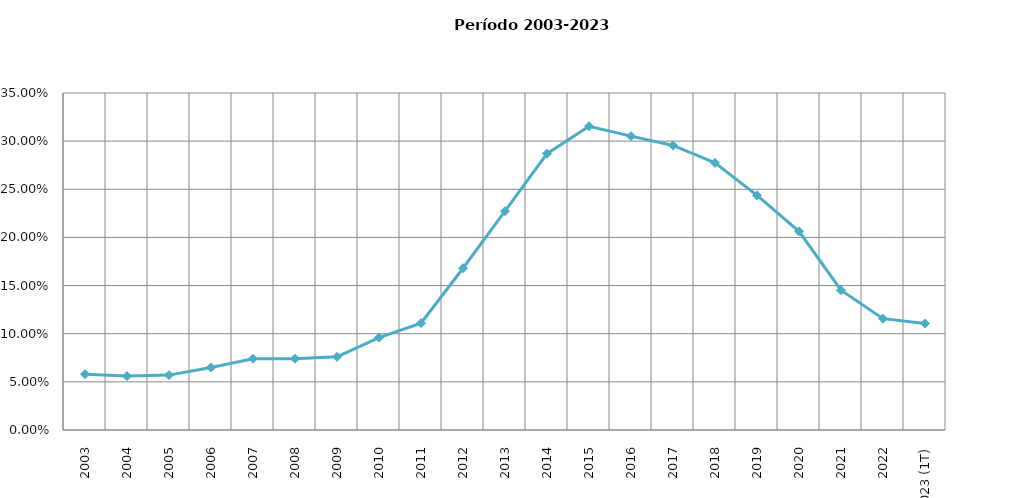
| Category | Grado estimado de penetración del servicio |
|---|---|
| 2003 | 0.058 |
| 2004 | 0.056 |
| 2005 | 0.057 |
| 2006 | 0.065 |
| 2007 | 0.074 |
| 2008 | 0.074 |
| 2009 | 0.076 |
| 2010 | 0.096 |
| 2011 | 0.111 |
| 2012 | 0.168 |
| 2013 | 0.227 |
| 2014 | 0.287 |
| 2015 | 0.315 |
| 2016 | 0.305 |
| 2017 | 0.296 |
| 2018 | 0.277 |
| 2019 | 0.244 |
| 2020 | 0.206 |
| 2021 | 0.145 |
| 2022 | 0.116 |
| 2023 (1T) | 0.111 |